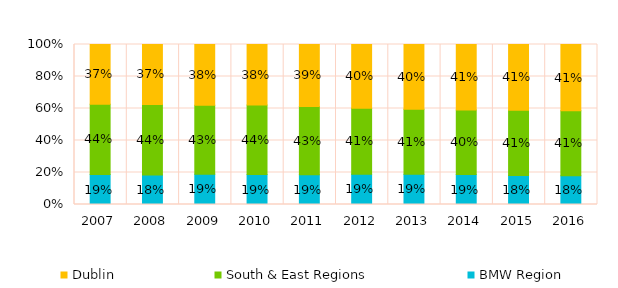
| Category | BMW Region | South & East Regions | Dublin |
|---|---|---|---|
| 2007.0 | 0.187 | 0.44 | 0.373 |
| 2008.0 | 0.185 | 0.441 | 0.375 |
| 2009.0 | 0.189 | 0.432 | 0.379 |
| 2010.0 | 0.187 | 0.435 | 0.378 |
| 2011.0 | 0.187 | 0.43 | 0.39 |
| 2012.0 | 0.189 | 0.413 | 0.398 |
| 2013.0 | 0.188 | 0.407 | 0.405 |
| 2014.0 | 0.187 | 0.404 | 0.409 |
| 2015.0 | 0.181 | 0.408 | 0.411 |
| 2016.0 | 0.18 | 0.406 | 0.414 |